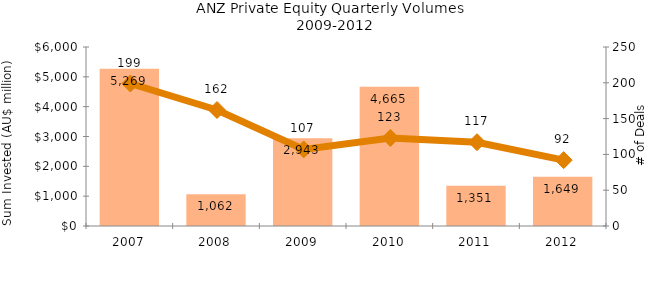
| Category | Series 1 |
|---|---|
| 2007.0 | 5269.424 |
| 2008.0 | 1061.858 |
| 2009.0 | 2942.604 |
| 2010.0 | 4664.672 |
| 2011.0 | 1351.068 |
| 2012.0 | 1649.173 |